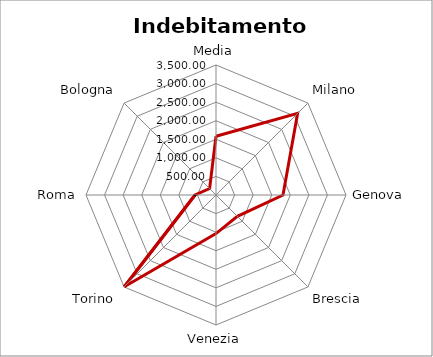
| Category | Indebitamento procapite |
|---|---|
| Media | 1580.777 |
| Milano | 3108.29 |
| Genova | 1803.75 |
| Brescia | 813.35 |
| Venezia | 1039.38 |
| Torino | 3492.23 |
| Roma | 564.58 |
| Bologna | 243.86 |